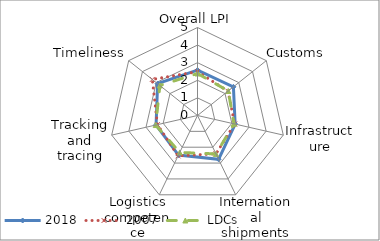
| Category | 2018 | 2007 | LDCs |
|---|---|---|---|
| Overall LPI | 2.575 | 2.491 | 2.387 |
| Customs | 2.611 | 2.214 | 2.236 |
| Infrastructure | 2.194 | 2.167 | 2.128 |
| International shipments | 2.761 | 2.417 | 2.422 |
| Logistics competence | 2.496 | 2.545 | 2.329 |
| Tracking and tracing | 2.414 | 2.333 | 2.437 |
| Timeliness | 2.899 | 3.286 | 2.734 |